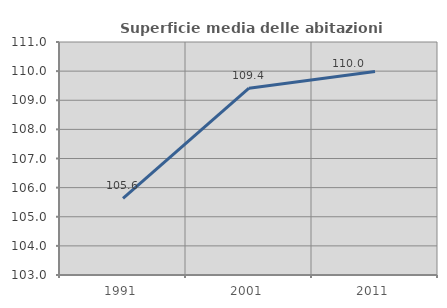
| Category | Superficie media delle abitazioni occupate |
|---|---|
| 1991.0 | 105.635 |
| 2001.0 | 109.415 |
| 2011.0 | 109.989 |